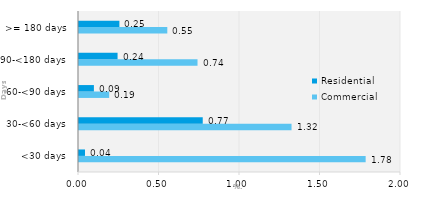
| Category | Commercial | Residential |
|---|---|---|
| <30 days | 1.78 | 0.037 |
| 30-<60 days | 1.32 | 0.769 |
| 60-<90 days | 0.187 | 0.093 |
| 90-<180 days | 0.736 | 0.24 |
| >= 180 days | 0.548 | 0.251 |